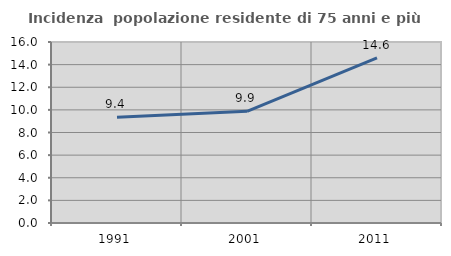
| Category | Incidenza  popolazione residente di 75 anni e più |
|---|---|
| 1991.0 | 9.35 |
| 2001.0 | 9.872 |
| 2011.0 | 14.592 |